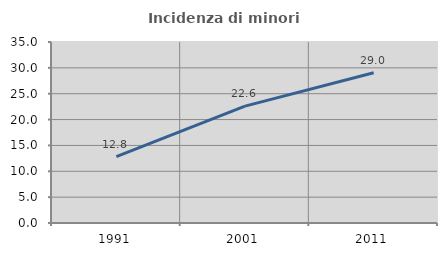
| Category | Incidenza di minori stranieri |
|---|---|
| 1991.0 | 12.821 |
| 2001.0 | 22.599 |
| 2011.0 | 29.048 |